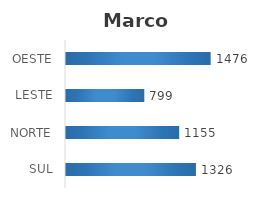
| Category | Series 0 |
|---|---|
| SUL | 1326 |
| NORTE | 1155 |
| LESTE | 799 |
| OESTE | 1476 |